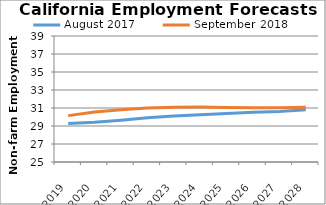
| Category | August 2017 | September 2018 |
|---|---|---|
| 2019.0 | 29.278 | 30.152 |
| 2020.0 | 29.408 | 30.554 |
| 2021.0 | 29.629 | 30.808 |
| 2022.0 | 29.905 | 31.01 |
| 2023.0 | 30.11 | 31.083 |
| 2024.0 | 30.264 | 31.098 |
| 2025.0 | 30.389 | 31.062 |
| 2026.0 | 30.516 | 31.033 |
| 2027.0 | 30.612 | 31.021 |
| 2028.0 | 30.795 | 31.077 |